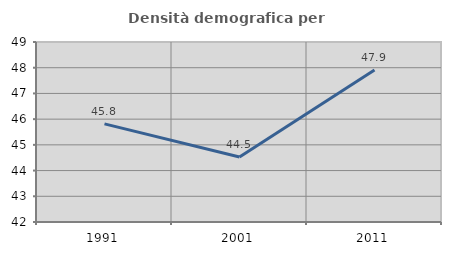
| Category | Densità demografica |
|---|---|
| 1991.0 | 45.816 |
| 2001.0 | 44.525 |
| 2011.0 | 47.913 |